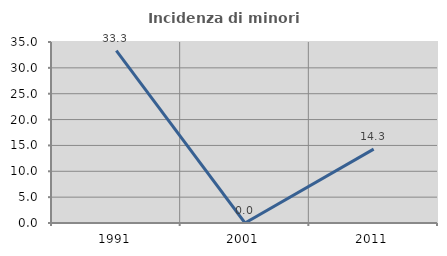
| Category | Incidenza di minori stranieri |
|---|---|
| 1991.0 | 33.333 |
| 2001.0 | 0 |
| 2011.0 | 14.286 |